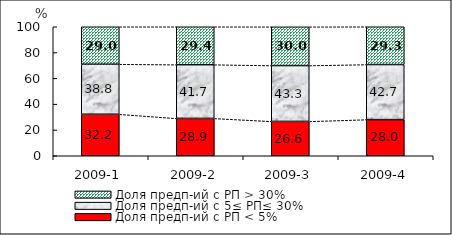
| Category | Доля предп-ий с РП < 5% | Доля предп-ий с 5≤ РП≤ 30% | Доля предп-ий с РП > 30% |
|---|---|---|---|
| 2009-1 | 32.18 | 38.78 | 29.04 |
| 2009-2 | 28.94 | 41.66 | 29.4 |
| 2009-3 | 26.63 | 43.3 | 30.01 |
| 2009-4 | 28.04 | 42.67 | 29.29 |